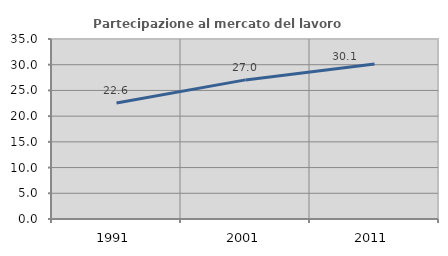
| Category | Partecipazione al mercato del lavoro  femminile |
|---|---|
| 1991.0 | 22.564 |
| 2001.0 | 27.048 |
| 2011.0 | 30.14 |